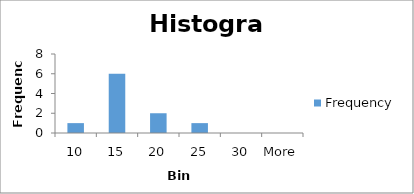
| Category | Frequency |
|---|---|
| 10 | 1 |
| 15 | 6 |
| 20 | 2 |
| 25 | 1 |
| 30 | 0 |
| More | 0 |